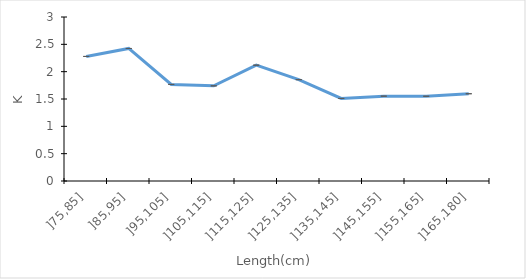
| Category | Series 0 |
|---|---|
| ]75,85] | 2.279 |
| ]85,95] | 2.424 |
| ]95,105] | 1.767 |
| ]105,115] | 1.741 |
| ]115,125] | 2.119 |
| ]125,135] | 1.854 |
| ]135,145] | 1.51 |
| ]145,155] | 1.552 |
| ]155,165] | 1.55 |
| ]165,180] | 1.596 |